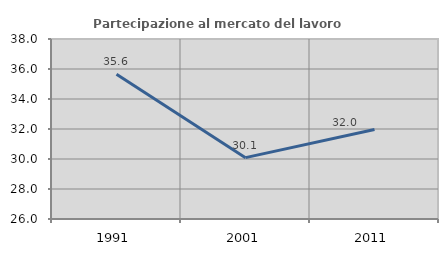
| Category | Partecipazione al mercato del lavoro  femminile |
|---|---|
| 1991.0 | 35.648 |
| 2001.0 | 30.09 |
| 2011.0 | 31.961 |